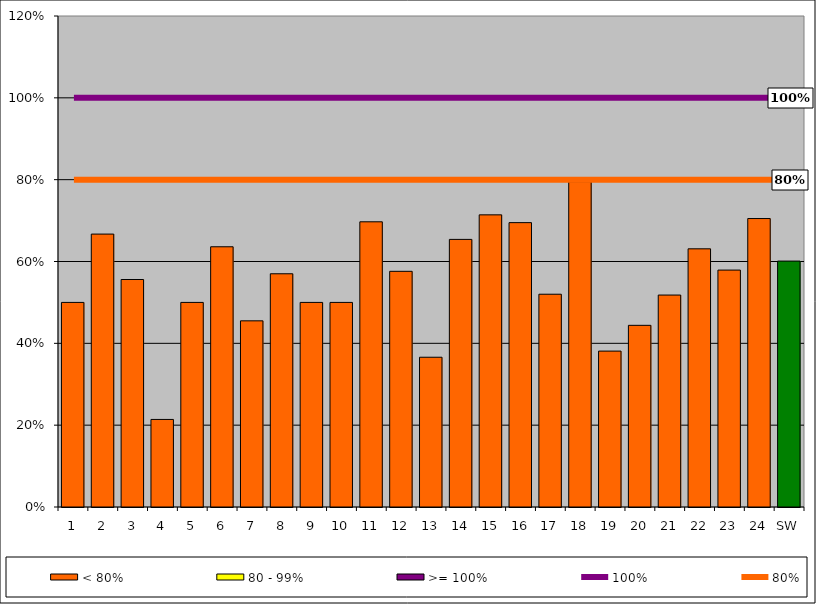
| Category | < 80% | 80 - 99% | >= 100% |
|---|---|---|---|
| 1 | 0.5 | 0 | 0 |
| 2 | 0.667 | 0 | 0 |
| 3 | 0.556 | 0 | 0 |
| 4 | 0.214 | 0 | 0 |
| 5 | 0.5 | 0 | 0 |
| 6 | 0.636 | 0 | 0 |
| 7 | 0.455 | 0 | 0 |
| 8 | 0.57 | 0 | 0 |
| 9 | 0.5 | 0 | 0 |
| 10 | 0.5 | 0 | 0 |
| 11 | 0.697 | 0 | 0 |
| 12 | 0.576 | 0 | 0 |
| 13 | 0.366 | 0 | 0 |
| 14 | 0.654 | 0 | 0 |
| 15 | 0.714 | 0 | 0 |
| 16 | 0.695 | 0 | 0 |
| 17 | 0.52 | 0 | 0 |
| 18 | 0.795 | 0 | 0 |
| 19 | 0.381 | 0 | 0 |
| 20 | 0.444 | 0 | 0 |
| 21 | 0.518 | 0 | 0 |
| 22 | 0.631 | 0 | 0 |
| 23 | 0.579 | 0 | 0 |
| 24 | 0.705 | 0 | 0 |
| SW | 0.601 | 0 | 0 |